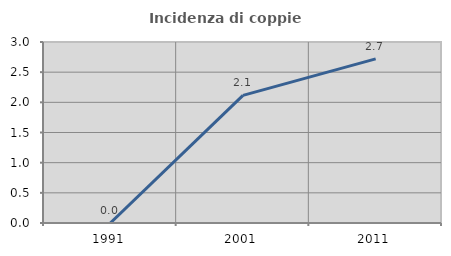
| Category | Incidenza di coppie miste |
|---|---|
| 1991.0 | 0 |
| 2001.0 | 2.115 |
| 2011.0 | 2.721 |